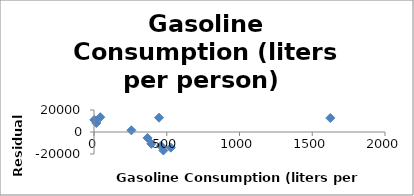
| Category | Series 0 |
|---|---|
| 2.0 | 11019.985 |
| 394.0 | -10761.166 |
| 368.0 | -5366.89 |
| 447.0 | 12986.859 |
| 16.0 | 8149.96 |
| 477.0 | -16837.706 |
| 43.0 | 13455.127 |
| 257.0 | 1516.622 |
| 460.0 | -12649.478 |
| 1624.0 | 12717.502 |
| 528.0 | -14230.815 |